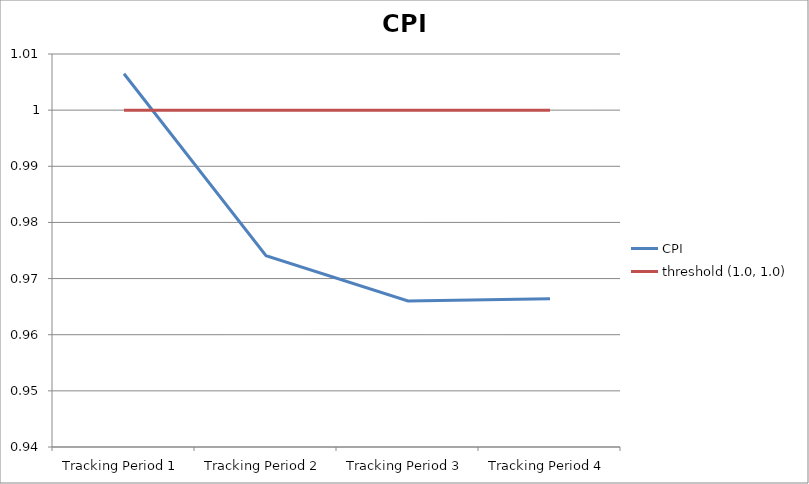
| Category | CPI | threshold (1.0, 1.0) |
|---|---|---|
| Tracking Period 1 | 1.006 | 1 |
| Tracking Period 2 | 0.974 | 1 |
| Tracking Period 3 | 0.966 | 1 |
| Tracking Period 4 | 0.966 | 1 |